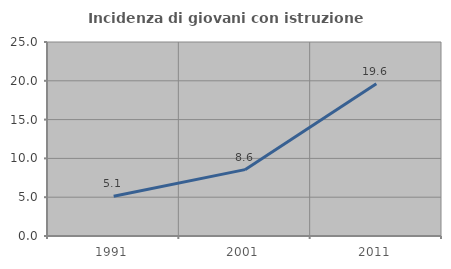
| Category | Incidenza di giovani con istruzione universitaria |
|---|---|
| 1991.0 | 5.128 |
| 2001.0 | 8.553 |
| 2011.0 | 19.62 |